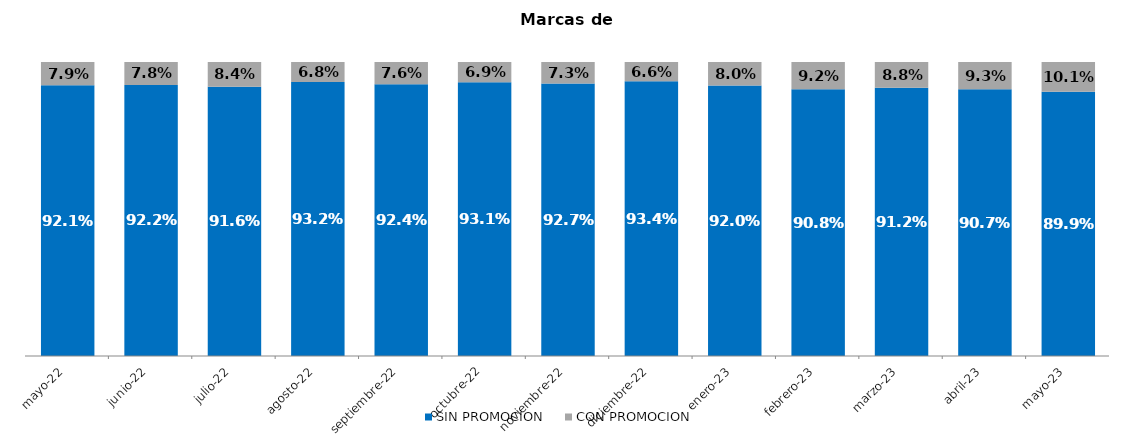
| Category | SIN PROMOCION   | CON PROMOCION   |
|---|---|---|
| 2022-05-01 | 0.921 | 0.079 |
| 2022-06-01 | 0.922 | 0.078 |
| 2022-07-01 | 0.916 | 0.084 |
| 2022-08-01 | 0.932 | 0.068 |
| 2022-09-01 | 0.924 | 0.076 |
| 2022-10-01 | 0.931 | 0.069 |
| 2022-11-01 | 0.927 | 0.073 |
| 2022-12-01 | 0.934 | 0.066 |
| 2023-01-01 | 0.92 | 0.08 |
| 2023-02-01 | 0.908 | 0.092 |
| 2023-03-01 | 0.912 | 0.088 |
| 2023-04-01 | 0.907 | 0.093 |
| 2023-05-01 | 0.899 | 0.101 |